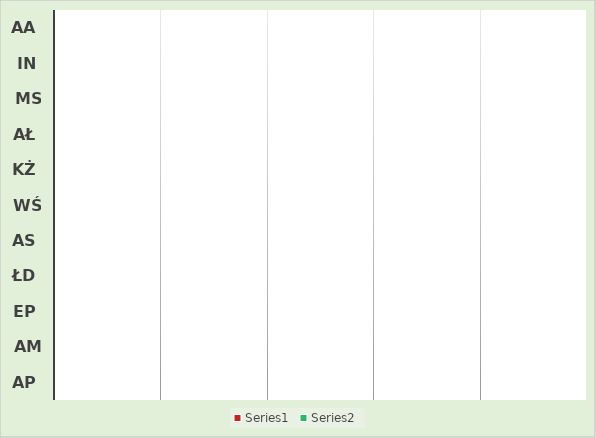
| Category | Series 0 | Series 1 |
|---|---|---|
| AA | 0 | 0 |
| IN | 0 | 0 |
| MS | 0 | 0 |
| AŁ | 0 | 0 |
| KŻ | 0 | 0 |
| WŚ | 0 | 0 |
| AS | 0 | 0 |
| ŁD | 0 | 0 |
| EP | 0 | 0 |
| AM | 0 | 0 |
| AP | 0 | 0 |